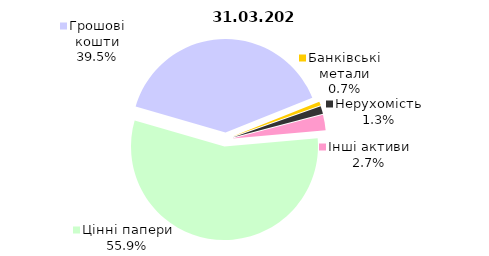
| Category | Вид НПФ |
|---|---|
| Цінні папери | 1362.91 |
| Грошові кошти | 963.091 |
| Банківські метали | 16.052 |
| Нерухомість | 32.61 |
| Інші активи | 65.384 |